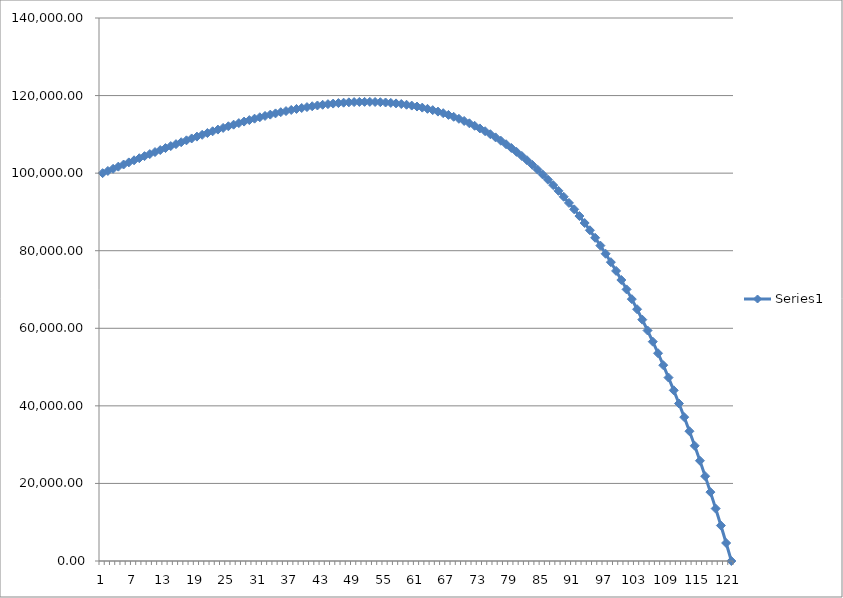
| Category | Series 0 |
|---|---|
| 0 | 100000 |
| 1 | 100560.943 |
| 2 | 101118.671 |
| 3 | 101672.974 |
| 4 | 102223.636 |
| 5 | 102770.437 |
| 6 | 103313.15 |
| 7 | 103851.542 |
| 8 | 104385.373 |
| 9 | 104914.398 |
| 10 | 105438.366 |
| 11 | 105957.017 |
| 12 | 106470.086 |
| 13 | 106977.302 |
| 14 | 107478.384 |
| 15 | 107973.046 |
| 16 | 108460.995 |
| 17 | 108941.928 |
| 18 | 109415.537 |
| 19 | 109881.504 |
| 20 | 110339.504 |
| 21 | 110789.203 |
| 22 | 111230.261 |
| 23 | 111662.325 |
| 24 | 112085.038 |
| 25 | 112498.03 |
| 26 | 112900.923 |
| 27 | 113293.332 |
| 28 | 113674.86 |
| 29 | 114045.099 |
| 30 | 114403.634 |
| 31 | 114750.037 |
| 32 | 115083.873 |
| 33 | 115404.692 |
| 34 | 115712.036 |
| 35 | 116005.434 |
| 36 | 116284.406 |
| 37 | 116548.457 |
| 38 | 116797.084 |
| 39 | 117029.768 |
| 40 | 117245.979 |
| 41 | 117445.175 |
| 42 | 117626.801 |
| 43 | 117790.287 |
| 44 | 117935.052 |
| 45 | 118060.497 |
| 46 | 118166.014 |
| 47 | 118250.977 |
| 48 | 118314.745 |
| 49 | 118356.665 |
| 50 | 118376.065 |
| 51 | 118372.259 |
| 52 | 118344.545 |
| 53 | 118292.205 |
| 54 | 118214.501 |
| 55 | 118110.682 |
| 56 | 117979.977 |
| 57 | 117821.597 |
| 58 | 117634.736 |
| 59 | 117418.569 |
| 60 | 117172.25 |
| 61 | 116894.916 |
| 62 | 116585.682 |
| 63 | 116243.645 |
| 64 | 115867.879 |
| 65 | 115457.437 |
| 66 | 115011.351 |
| 67 | 114528.632 |
| 68 | 114008.265 |
| 69 | 113449.215 |
| 70 | 112850.421 |
| 71 | 112210.801 |
| 72 | 111529.246 |
| 73 | 110804.621 |
| 74 | 110035.767 |
| 75 | 109221.499 |
| 76 | 108360.605 |
| 77 | 107451.844 |
| 78 | 106493.949 |
| 79 | 105485.624 |
| 80 | 104425.543 |
| 81 | 103312.35 |
| 82 | 102144.661 |
| 83 | 100921.059 |
| 84 | 99640.095 |
| 85 | 98300.29 |
| 86 | 96900.128 |
| 87 | 95438.063 |
| 88 | 93912.513 |
| 89 | 92321.861 |
| 90 | 90664.454 |
| 91 | 88938.602 |
| 92 | 87142.579 |
| 93 | 85274.618 |
| 94 | 83332.916 |
| 95 | 81315.629 |
| 96 | 79220.872 |
| 97 | 77046.718 |
| 98 | 74791.199 |
| 99 | 72452.302 |
| 100 | 70027.971 |
| 101 | 67516.105 |
| 102 | 64914.556 |
| 103 | 62221.13 |
| 104 | 59433.584 |
| 105 | 56549.626 |
| 106 | 53566.915 |
| 107 | 50483.058 |
| 108 | 47295.609 |
| 109 | 44002.072 |
| 110 | 40599.893 |
| 111 | 37086.463 |
| 112 | 33459.119 |
| 113 | 29715.138 |
| 114 | 25851.737 |
| 115 | 21866.075 |
| 116 | 17755.249 |
| 117 | 13516.291 |
| 118 | 9146.172 |
| 119 | 4641.796 |
| 120 | 0 |